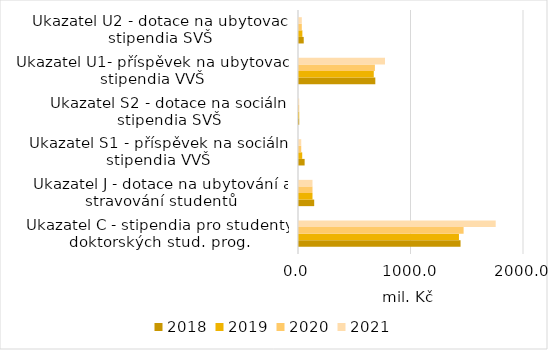
| Category | 2018 | 2019 | 2020 | 2021 |
|---|---|---|---|---|
| Ukazatel C - stipendia pro studenty doktorských stud. prog. | 1436 | 1421.82 | 1463.13 | 1748.385 |
| Ukazatel J - dotace na ubytování a stravování studentů | 135 | 120 | 120 | 120 |
| Ukazatel S1 - příspěvek na sociální stipendia VVŠ | 50 | 28.553 | 20 | 20 |
| Ukazatel S2 - dotace na sociální stipendia SVŠ | 2 | 2 | 2 | 2 |
| Ukazatel U1- příspěvek na ubytovací stipendia VVŠ | 678.31 | 664.627 | 674.784 | 764.311 |
| Ukazatel U2 - dotace na ubytovací stipendia SVŠ | 42 | 30 | 25 | 25 |